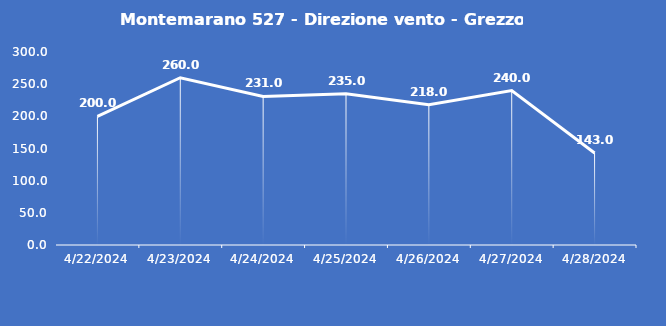
| Category | Montemarano 527 - Direzione vento - Grezzo (°N) |
|---|---|
| 4/22/24 | 200 |
| 4/23/24 | 260 |
| 4/24/24 | 231 |
| 4/25/24 | 235 |
| 4/26/24 | 218 |
| 4/27/24 | 240 |
| 4/28/24 | 143 |